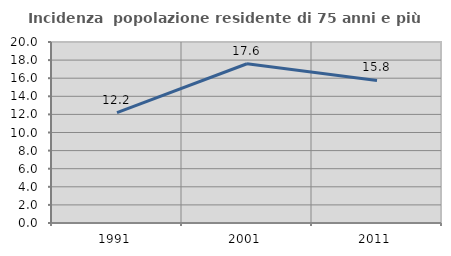
| Category | Incidenza  popolazione residente di 75 anni e più |
|---|---|
| 1991.0 | 12.194 |
| 2001.0 | 17.596 |
| 2011.0 | 15.756 |